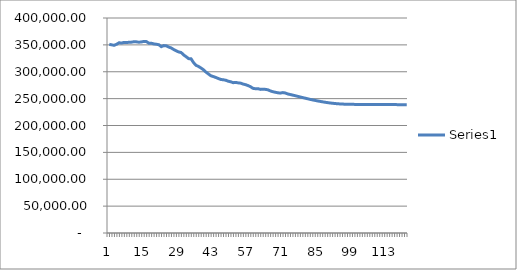
| Category | Series 0 |
|---|---|
| 0 | 351055.206 |
| 1 | 350020.385 |
| 2 | 349174.787 |
| 3 | 351250.387 |
| 4 | 353942.312 |
| 5 | 353406.978 |
| 6 | 354613.771 |
| 7 | 354289.114 |
| 8 | 354877.845 |
| 9 | 355082.323 |
| 10 | 355831.385 |
| 11 | 355591.604 |
| 12 | 354908.058 |
| 13 | 355559.219 |
| 14 | 356398.586 |
| 15 | 356065.342 |
| 16 | 353118.593 |
| 17 | 353012.675 |
| 18 | 351770.224 |
| 19 | 351191.322 |
| 20 | 350335.01 |
| 21 | 346678.414 |
| 22 | 348690.61 |
| 23 | 348156.567 |
| 24 | 345922.953 |
| 25 | 344227.598 |
| 26 | 341374.517 |
| 27 | 338908.915 |
| 28 | 336876.981 |
| 29 | 335753.531 |
| 30 | 331357.395 |
| 31 | 328065.235 |
| 32 | 324401.555 |
| 33 | 324034.858 |
| 34 | 317029.06 |
| 35 | 312029.156 |
| 36 | 309824.047 |
| 37 | 306983.053 |
| 38 | 303697.957 |
| 39 | 299426.025 |
| 40 | 295919.44 |
| 41 | 292494.45 |
| 42 | 290984.585 |
| 43 | 289368.463 |
| 44 | 287400.48 |
| 45 | 285693.012 |
| 46 | 285079.767 |
| 47 | 284197.847 |
| 48 | 282404.762 |
| 49 | 281288.033 |
| 50 | 279692.511 |
| 51 | 280180.591 |
| 52 | 279320.988 |
| 53 | 278761.301 |
| 54 | 277069.355 |
| 55 | 275918.745 |
| 56 | 274282.337 |
| 57 | 272094.175 |
| 58 | 269116.315 |
| 59 | 268368.363 |
| 60 | 268580.254 |
| 61 | 267184.222 |
| 62 | 267630.576 |
| 63 | 267203.916 |
| 64 | 266371.081 |
| 65 | 264327.319 |
| 66 | 262873.28 |
| 67 | 261785.302 |
| 68 | 260902.267 |
| 69 | 260260.375 |
| 70 | 261231.233 |
| 71 | 260463.206 |
| 72 | 258706.109 |
| 73 | 257635.084 |
| 74 | 256540.147 |
| 75 | 255422.002 |
| 76 | 254286.219 |
| 77 | 253141.492 |
| 78 | 251995.057 |
| 79 | 250857.522 |
| 80 | 249739.231 |
| 81 | 248659.339 |
| 82 | 247639.302 |
| 83 | 246682.936 |
| 84 | 245773.815 |
| 85 | 244902.177 |
| 86 | 244074.033 |
| 87 | 243302.476 |
| 88 | 242602.732 |
| 89 | 241973.304 |
| 90 | 241412.047 |
| 91 | 240915.194 |
| 92 | 240495.759 |
| 93 | 240152.626 |
| 94 | 239880.395 |
| 95 | 239664.291 |
| 96 | 239501.78 |
| 97 | 239391.68 |
| 98 | 239328.137 |
| 99 | 239290.885 |
| 100 | 239268.858 |
| 101 | 239253.88 |
| 102 | 239247.037 |
| 103 | 239241.391 |
| 104 | 239227.067 |
| 105 | 239195.763 |
| 106 | 239155.162 |
| 107 | 239118.261 |
| 108 | 239089.315 |
| 109 | 239063.251 |
| 110 | 239028.756 |
| 111 | 238980.814 |
| 112 | 238929.783 |
| 113 | 238886.654 |
| 114 | 238858.385 |
| 115 | 238841.682 |
| 116 | 238831.361 |
| 117 | 238817.609 |
| 118 | 238792.271 |
| 119 | 238746.464 |
| 120 | 238680.694 |